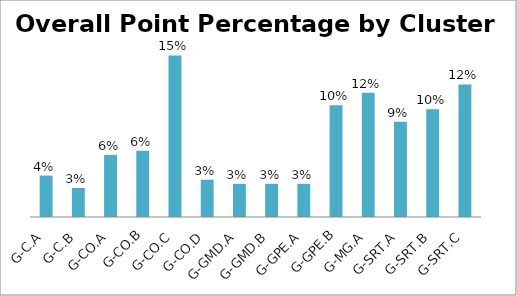
| Category | Overall Point Percentage |
|---|---|
| G-C.A | 0.039 |
| G-C.B | 0.027 |
| G-CO.A | 0.058 |
| G-CO.B | 0.062 |
| G-CO.C | 0.151 |
| G-CO.D | 0.035 |
| G-GMD.A | 0.031 |
| G-GMD.B | 0.031 |
| G-GPE.A | 0.031 |
| G-GPE.B | 0.105 |
| G-MG.A | 0.116 |
| G-SRT.A | 0.089 |
| G-SRT.B | 0.101 |
| G-SRT.C | 0.124 |